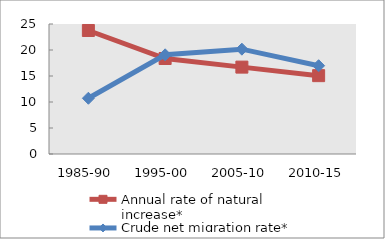
| Category | Annual rate of natural increase* | Crude net migration rate* |
|---|---|---|
| 1985-90 | 23.751 | 10.72 |
| 1995-00 | 18.366 | 19.073 |
| 2005-10 | 16.709 | 20.161 |
| 2010-15 | 15.068 | 16.98 |